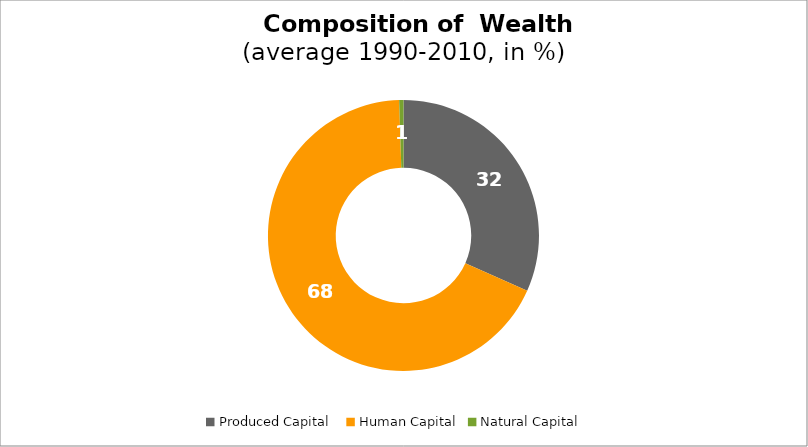
| Category | Series 0 |
|---|---|
| Produced Capital  | 31.694 |
| Human Capital | 67.792 |
| Natural Capital | 0.514 |